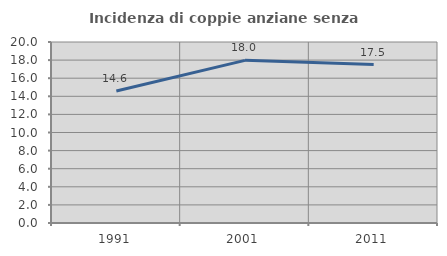
| Category | Incidenza di coppie anziane senza figli  |
|---|---|
| 1991.0 | 14.581 |
| 2001.0 | 17.971 |
| 2011.0 | 17.51 |